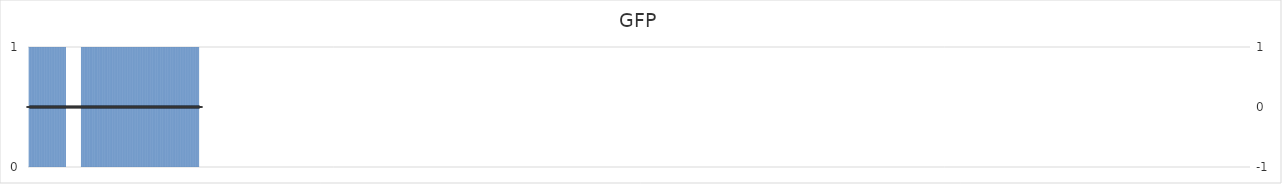
| Category | GFP |
|---|---|
| 1.0 | 0 |
| 2.0 | 1 |
| 3.0 | 1 |
| 4.0 | 1 |
| 5.0 | 1 |
| 6.0 | 1 |
| 7.0 | 1 |
| 8.0 | 1 |
| 9.0 | 1 |
| 10.0 | 1 |
| 11.0 | 1 |
| 12.0 | 1 |
| 13.0 | 1 |
| 14.0 | 1 |
| 15.0 | 1 |
| 16.0 | 1 |
| 17.0 | 1 |
| 18.0 | 1 |
| 19.0 | 1 |
| 20.0 | 1 |
| 21.0 | 1 |
| 22.0 | 1 |
| 23.0 | 1 |
| 24.0 | 1 |
| 25.0 | 1 |
| 26.0 | 1 |
| 27.0 | 1 |
| 28.0 | 1 |
| 29.0 | 1 |
| 30.0 | 1 |
| 31.0 | 1 |
| 32.0 | 1 |
| 33.0 | 1 |
| 34.0 | 1 |
| 35.0 | 1 |
| 36.0 | 1 |
| 37.0 | 1 |
| 38.0 | 1 |
| 39.0 | 1 |
| 40.0 | 1 |
| 41.0 | 1 |
| 42.0 | 1 |
| 43.0 | 1 |
| 44.0 | 1 |
| 45.0 | 1 |
| 46.0 | 1 |
| 47.0 | 1 |
| 48.0 | 1 |
| 49.0 | 1 |
| 50.0 | 1 |
| 51.0 | 1 |
| 52.0 | 1 |
| 53.0 | 1 |
| 54.0 | 0 |
| 55.0 | 0 |
| 56.0 | 0 |
| 57.0 | 0 |
| 58.0 | 0 |
| 59.0 | 0 |
| 60.0 | 0 |
| 61.0 | 0 |
| 62.0 | 0 |
| 63.0 | 0 |
| 64.0 | 0 |
| 65.0 | 0 |
| 66.0 | 0 |
| 67.0 | 0 |
| 68.0 | 0 |
| 69.0 | 0 |
| 70.0 | 0 |
| 71.0 | 0 |
| 72.0 | 0 |
| 73.0 | 0 |
| 74.0 | 0 |
| 75.0 | 1 |
| 76.0 | 1 |
| 77.0 | 1 |
| 78.0 | 1 |
| 79.0 | 1 |
| 80.0 | 1 |
| 81.0 | 1 |
| 82.0 | 1 |
| 83.0 | 1 |
| 84.0 | 1 |
| 85.0 | 1 |
| 86.0 | 1 |
| 87.0 | 1 |
| 88.0 | 1 |
| 89.0 | 1 |
| 90.0 | 1 |
| 91.0 | 1 |
| 92.0 | 1 |
| 93.0 | 1 |
| 94.0 | 1 |
| 95.0 | 1 |
| 96.0 | 1 |
| 97.0 | 1 |
| 98.0 | 1 |
| 99.0 | 1 |
| 100.0 | 1 |
| 101.0 | 1 |
| 102.0 | 1 |
| 103.0 | 1 |
| 104.0 | 1 |
| 105.0 | 1 |
| 106.0 | 1 |
| 107.0 | 1 |
| 108.0 | 1 |
| 109.0 | 1 |
| 110.0 | 1 |
| 111.0 | 1 |
| 112.0 | 1 |
| 113.0 | 1 |
| 114.0 | 1 |
| 115.0 | 1 |
| 116.0 | 1 |
| 117.0 | 1 |
| 118.0 | 1 |
| 119.0 | 1 |
| 120.0 | 1 |
| 121.0 | 1 |
| 122.0 | 1 |
| 123.0 | 1 |
| 124.0 | 1 |
| 125.0 | 1 |
| 126.0 | 1 |
| 127.0 | 1 |
| 128.0 | 1 |
| 129.0 | 1 |
| 130.0 | 1 |
| 131.0 | 1 |
| 132.0 | 1 |
| 133.0 | 1 |
| 134.0 | 1 |
| 135.0 | 1 |
| 136.0 | 1 |
| 137.0 | 1 |
| 138.0 | 1 |
| 139.0 | 1 |
| 140.0 | 1 |
| 141.0 | 1 |
| 142.0 | 1 |
| 143.0 | 1 |
| 144.0 | 1 |
| 145.0 | 1 |
| 146.0 | 1 |
| 147.0 | 1 |
| 148.0 | 1 |
| 149.0 | 1 |
| 150.0 | 1 |
| 151.0 | 1 |
| 152.0 | 1 |
| 153.0 | 1 |
| 154.0 | 1 |
| 155.0 | 1 |
| 156.0 | 1 |
| 157.0 | 1 |
| 158.0 | 1 |
| 159.0 | 1 |
| 160.0 | 1 |
| 161.0 | 1 |
| 162.0 | 1 |
| 163.0 | 1 |
| 164.0 | 1 |
| 165.0 | 1 |
| 166.0 | 1 |
| 167.0 | 1 |
| 168.0 | 1 |
| 169.0 | 1 |
| 170.0 | 1 |
| 171.0 | 1 |
| 172.0 | 1 |
| 173.0 | 1 |
| 174.0 | 1 |
| 175.0 | 1 |
| 176.0 | 1 |
| 177.0 | 1 |
| 178.0 | 1 |
| 179.0 | 1 |
| 180.0 | 1 |
| 181.0 | 1 |
| 182.0 | 1 |
| 183.0 | 1 |
| 184.0 | 1 |
| 185.0 | 1 |
| 186.0 | 1 |
| 187.0 | 1 |
| 188.0 | 1 |
| 189.0 | 1 |
| 190.0 | 1 |
| 191.0 | 1 |
| 192.0 | 1 |
| 193.0 | 1 |
| 194.0 | 1 |
| 195.0 | 1 |
| 196.0 | 1 |
| 197.0 | 1 |
| 198.0 | 1 |
| 199.0 | 1 |
| 200.0 | 1 |
| 201.0 | 1 |
| 202.0 | 1 |
| 203.0 | 1 |
| 204.0 | 1 |
| 205.0 | 1 |
| 206.0 | 1 |
| 207.0 | 1 |
| 208.0 | 1 |
| 209.0 | 1 |
| 210.0 | 1 |
| 211.0 | 1 |
| 212.0 | 1 |
| 213.0 | 1 |
| 214.0 | 1 |
| 215.0 | 1 |
| 216.0 | 1 |
| 217.0 | 1 |
| 218.0 | 1 |
| 219.0 | 1 |
| 220.0 | 1 |
| 221.0 | 1 |
| 222.0 | 1 |
| 223.0 | 1 |
| 224.0 | 1 |
| 225.0 | 1 |
| 226.0 | 1 |
| 227.0 | 1 |
| 228.0 | 1 |
| 229.0 | 1 |
| 230.0 | 1 |
| 231.0 | 1 |
| 232.0 | 1 |
| 233.0 | 1 |
| 234.0 | 1 |
| 235.0 | 1 |
| 236.0 | 1 |
| 237.0 | 1 |
| 238.0 | 1 |
| 239.0 | 1 |
| 240.0 | 0 |
| 241.0 | 0 |
| 242.0 | 0 |
| 243.0 | 0 |
| 244.0 | 0 |
| 245.0 | 0 |
| 246.0 | 0 |
| 247.0 | 0 |
| 248.0 | 0 |
| 249.0 | 0 |
| 250.0 | 0 |
| 251.0 | 0 |
| 252.0 | 0 |
| 253.0 | 0 |
| 254.0 | 0 |
| 255.0 | 0 |
| 256.0 | 0 |
| 257.0 | 0 |
| 258.0 | 0 |
| 259.0 | 0 |
| 260.0 | 0 |
| 261.0 | 0 |
| 262.0 | 0 |
| 263.0 | 0 |
| 264.0 | 0 |
| 265.0 | 0 |
| 266.0 | 0 |
| 267.0 | 0 |
| 268.0 | 0 |
| 269.0 | 0 |
| 270.0 | 0 |
| 271.0 | 0 |
| 272.0 | 0 |
| 273.0 | 0 |
| 274.0 | 0 |
| 275.0 | 0 |
| 276.0 | 0 |
| 277.0 | 0 |
| 278.0 | 0 |
| 279.0 | 0 |
| 280.0 | 0 |
| 281.0 | 0 |
| 282.0 | 0 |
| 283.0 | 0 |
| 284.0 | 0 |
| 285.0 | 0 |
| 286.0 | 0 |
| 287.0 | 0 |
| 288.0 | 0 |
| 289.0 | 0 |
| 290.0 | 0 |
| 291.0 | 0 |
| 292.0 | 0 |
| 293.0 | 0 |
| 294.0 | 0 |
| 295.0 | 0 |
| 296.0 | 0 |
| 297.0 | 0 |
| 298.0 | 0 |
| 299.0 | 0 |
| 300.0 | 0 |
| 301.0 | 0 |
| 302.0 | 0 |
| 303.0 | 0 |
| 304.0 | 0 |
| 305.0 | 0 |
| 306.0 | 0 |
| 307.0 | 0 |
| 308.0 | 0 |
| 309.0 | 0 |
| 310.0 | 0 |
| 311.0 | 0 |
| 312.0 | 0 |
| 313.0 | 0 |
| 314.0 | 0 |
| 315.0 | 0 |
| 316.0 | 0 |
| 317.0 | 0 |
| 318.0 | 0 |
| 319.0 | 0 |
| 320.0 | 0 |
| 321.0 | 0 |
| 322.0 | 0 |
| 323.0 | 0 |
| 324.0 | 0 |
| 325.0 | 0 |
| 326.0 | 0 |
| 327.0 | 0 |
| 328.0 | 0 |
| 329.0 | 0 |
| 330.0 | 0 |
| 331.0 | 0 |
| 332.0 | 0 |
| 333.0 | 0 |
| 334.0 | 0 |
| 335.0 | 0 |
| 336.0 | 0 |
| 337.0 | 0 |
| 338.0 | 0 |
| 339.0 | 0 |
| 340.0 | 0 |
| 341.0 | 0 |
| 342.0 | 0 |
| 343.0 | 0 |
| 344.0 | 0 |
| 345.0 | 0 |
| 346.0 | 0 |
| 347.0 | 0 |
| 348.0 | 0 |
| 349.0 | 0 |
| 350.0 | 0 |
| 351.0 | 0 |
| 352.0 | 0 |
| 353.0 | 0 |
| 354.0 | 0 |
| 355.0 | 0 |
| 356.0 | 0 |
| 357.0 | 0 |
| 358.0 | 0 |
| 359.0 | 0 |
| 360.0 | 0 |
| 361.0 | 0 |
| 362.0 | 0 |
| 363.0 | 0 |
| 364.0 | 0 |
| 365.0 | 0 |
| 366.0 | 0 |
| 367.0 | 0 |
| 368.0 | 0 |
| 369.0 | 0 |
| 370.0 | 0 |
| 371.0 | 0 |
| 372.0 | 0 |
| 373.0 | 0 |
| 374.0 | 0 |
| 375.0 | 0 |
| 376.0 | 0 |
| 377.0 | 0 |
| 378.0 | 0 |
| 379.0 | 0 |
| 380.0 | 0 |
| 381.0 | 0 |
| 382.0 | 0 |
| 383.0 | 0 |
| 384.0 | 0 |
| 385.0 | 0 |
| 386.0 | 0 |
| 387.0 | 0 |
| 388.0 | 0 |
| 389.0 | 0 |
| 390.0 | 0 |
| 391.0 | 0 |
| 392.0 | 0 |
| 393.0 | 0 |
| 394.0 | 0 |
| 395.0 | 0 |
| 396.0 | 0 |
| 397.0 | 0 |
| 398.0 | 0 |
| 399.0 | 0 |
| 400.0 | 0 |
| 401.0 | 0 |
| 402.0 | 0 |
| 403.0 | 0 |
| 404.0 | 0 |
| 405.0 | 0 |
| 406.0 | 0 |
| 407.0 | 0 |
| 408.0 | 0 |
| 409.0 | 0 |
| 410.0 | 0 |
| 411.0 | 0 |
| 412.0 | 0 |
| 413.0 | 0 |
| 414.0 | 0 |
| 415.0 | 0 |
| 416.0 | 0 |
| 417.0 | 0 |
| 418.0 | 0 |
| 419.0 | 0 |
| 420.0 | 0 |
| 421.0 | 0 |
| 422.0 | 0 |
| 423.0 | 0 |
| 424.0 | 0 |
| 425.0 | 0 |
| 426.0 | 0 |
| 427.0 | 0 |
| 428.0 | 0 |
| 429.0 | 0 |
| 430.0 | 0 |
| 431.0 | 0 |
| 432.0 | 0 |
| 433.0 | 0 |
| 434.0 | 0 |
| 435.0 | 0 |
| 436.0 | 0 |
| 437.0 | 0 |
| 438.0 | 0 |
| 439.0 | 0 |
| 440.0 | 0 |
| 441.0 | 0 |
| 442.0 | 0 |
| 443.0 | 0 |
| 444.0 | 0 |
| 445.0 | 0 |
| 446.0 | 0 |
| 447.0 | 0 |
| 448.0 | 0 |
| 449.0 | 0 |
| 450.0 | 0 |
| 451.0 | 0 |
| 452.0 | 0 |
| 453.0 | 0 |
| 454.0 | 0 |
| 455.0 | 0 |
| 456.0 | 0 |
| 457.0 | 0 |
| 458.0 | 0 |
| 459.0 | 0 |
| 460.0 | 0 |
| 461.0 | 0 |
| 462.0 | 0 |
| 463.0 | 0 |
| 464.0 | 0 |
| 465.0 | 0 |
| 466.0 | 0 |
| 467.0 | 0 |
| 468.0 | 0 |
| 469.0 | 0 |
| 470.0 | 0 |
| 471.0 | 0 |
| 472.0 | 0 |
| 473.0 | 0 |
| 474.0 | 0 |
| 475.0 | 0 |
| 476.0 | 0 |
| 477.0 | 0 |
| 478.0 | 0 |
| 479.0 | 0 |
| 480.0 | 0 |
| 481.0 | 0 |
| 482.0 | 0 |
| 483.0 | 0 |
| 484.0 | 0 |
| 485.0 | 0 |
| 486.0 | 0 |
| 487.0 | 0 |
| 488.0 | 0 |
| 489.0 | 0 |
| 490.0 | 0 |
| 491.0 | 0 |
| 492.0 | 0 |
| 493.0 | 0 |
| 494.0 | 0 |
| 495.0 | 0 |
| 496.0 | 0 |
| 497.0 | 0 |
| 498.0 | 0 |
| 499.0 | 0 |
| 500.0 | 0 |
| 501.0 | 0 |
| 502.0 | 0 |
| 503.0 | 0 |
| 504.0 | 0 |
| 505.0 | 0 |
| 506.0 | 0 |
| 507.0 | 0 |
| 508.0 | 0 |
| 509.0 | 0 |
| 510.0 | 0 |
| 511.0 | 0 |
| 512.0 | 0 |
| 513.0 | 0 |
| 514.0 | 0 |
| 515.0 | 0 |
| 516.0 | 0 |
| 517.0 | 0 |
| 518.0 | 0 |
| 519.0 | 0 |
| 520.0 | 0 |
| 521.0 | 0 |
| 522.0 | 0 |
| 523.0 | 0 |
| 524.0 | 0 |
| 525.0 | 0 |
| 526.0 | 0 |
| 527.0 | 0 |
| 528.0 | 0 |
| 529.0 | 0 |
| 530.0 | 0 |
| 531.0 | 0 |
| 532.0 | 0 |
| 533.0 | 0 |
| 534.0 | 0 |
| 535.0 | 0 |
| 536.0 | 0 |
| 537.0 | 0 |
| 538.0 | 0 |
| 539.0 | 0 |
| 540.0 | 0 |
| 541.0 | 0 |
| 542.0 | 0 |
| 543.0 | 0 |
| 544.0 | 0 |
| 545.0 | 0 |
| 546.0 | 0 |
| 547.0 | 0 |
| 548.0 | 0 |
| 549.0 | 0 |
| 550.0 | 0 |
| 551.0 | 0 |
| 552.0 | 0 |
| 553.0 | 0 |
| 554.0 | 0 |
| 555.0 | 0 |
| 556.0 | 0 |
| 557.0 | 0 |
| 558.0 | 0 |
| 559.0 | 0 |
| 560.0 | 0 |
| 561.0 | 0 |
| 562.0 | 0 |
| 563.0 | 0 |
| 564.0 | 0 |
| 565.0 | 0 |
| 566.0 | 0 |
| 567.0 | 0 |
| 568.0 | 0 |
| 569.0 | 0 |
| 570.0 | 0 |
| 571.0 | 0 |
| 572.0 | 0 |
| 573.0 | 0 |
| 574.0 | 0 |
| 575.0 | 0 |
| 576.0 | 0 |
| 577.0 | 0 |
| 578.0 | 0 |
| 579.0 | 0 |
| 580.0 | 0 |
| 581.0 | 0 |
| 582.0 | 0 |
| 583.0 | 0 |
| 584.0 | 0 |
| 585.0 | 0 |
| 586.0 | 0 |
| 587.0 | 0 |
| 588.0 | 0 |
| 589.0 | 0 |
| 590.0 | 0 |
| 591.0 | 0 |
| 592.0 | 0 |
| 593.0 | 0 |
| 594.0 | 0 |
| 595.0 | 0 |
| 596.0 | 0 |
| 597.0 | 0 |
| 598.0 | 0 |
| 599.0 | 0 |
| 600.0 | 0 |
| 601.0 | 0 |
| 602.0 | 0 |
| 603.0 | 0 |
| 604.0 | 0 |
| 605.0 | 0 |
| 606.0 | 0 |
| 607.0 | 0 |
| 608.0 | 0 |
| 609.0 | 0 |
| 610.0 | 0 |
| 611.0 | 0 |
| 612.0 | 0 |
| 613.0 | 0 |
| 614.0 | 0 |
| 615.0 | 0 |
| 616.0 | 0 |
| 617.0 | 0 |
| 618.0 | 0 |
| 619.0 | 0 |
| 620.0 | 0 |
| 621.0 | 0 |
| 622.0 | 0 |
| 623.0 | 0 |
| 624.0 | 0 |
| 625.0 | 0 |
| 626.0 | 0 |
| 627.0 | 0 |
| 628.0 | 0 |
| 629.0 | 0 |
| 630.0 | 0 |
| 631.0 | 0 |
| 632.0 | 0 |
| 633.0 | 0 |
| 634.0 | 0 |
| 635.0 | 0 |
| 636.0 | 0 |
| 637.0 | 0 |
| 638.0 | 0 |
| 639.0 | 0 |
| 640.0 | 0 |
| 641.0 | 0 |
| 642.0 | 0 |
| 643.0 | 0 |
| 644.0 | 0 |
| 645.0 | 0 |
| 646.0 | 0 |
| 647.0 | 0 |
| 648.0 | 0 |
| 649.0 | 0 |
| 650.0 | 0 |
| 651.0 | 0 |
| 652.0 | 0 |
| 653.0 | 0 |
| 654.0 | 0 |
| 655.0 | 0 |
| 656.0 | 0 |
| 657.0 | 0 |
| 658.0 | 0 |
| 659.0 | 0 |
| 660.0 | 0 |
| 661.0 | 0 |
| 662.0 | 0 |
| 663.0 | 0 |
| 664.0 | 0 |
| 665.0 | 0 |
| 666.0 | 0 |
| 667.0 | 0 |
| 668.0 | 0 |
| 669.0 | 0 |
| 670.0 | 0 |
| 671.0 | 0 |
| 672.0 | 0 |
| 673.0 | 0 |
| 674.0 | 0 |
| 675.0 | 0 |
| 676.0 | 0 |
| 677.0 | 0 |
| 678.0 | 0 |
| 679.0 | 0 |
| 680.0 | 0 |
| 681.0 | 0 |
| 682.0 | 0 |
| 683.0 | 0 |
| 684.0 | 0 |
| 685.0 | 0 |
| 686.0 | 0 |
| 687.0 | 0 |
| 688.0 | 0 |
| 689.0 | 0 |
| 690.0 | 0 |
| 691.0 | 0 |
| 692.0 | 0 |
| 693.0 | 0 |
| 694.0 | 0 |
| 695.0 | 0 |
| 696.0 | 0 |
| 697.0 | 0 |
| 698.0 | 0 |
| 699.0 | 0 |
| 700.0 | 0 |
| 701.0 | 0 |
| 702.0 | 0 |
| 703.0 | 0 |
| 704.0 | 0 |
| 705.0 | 0 |
| 706.0 | 0 |
| 707.0 | 0 |
| 708.0 | 0 |
| 709.0 | 0 |
| 710.0 | 0 |
| 711.0 | 0 |
| 712.0 | 0 |
| 713.0 | 0 |
| 714.0 | 0 |
| 715.0 | 0 |
| 716.0 | 0 |
| 717.0 | 0 |
| 718.0 | 0 |
| 719.0 | 0 |
| 720.0 | 0 |
| 721.0 | 0 |
| 722.0 | 0 |
| 723.0 | 0 |
| 724.0 | 0 |
| 725.0 | 0 |
| 726.0 | 0 |
| 727.0 | 0 |
| 728.0 | 0 |
| 729.0 | 0 |
| 730.0 | 0 |
| 731.0 | 0 |
| 732.0 | 0 |
| 733.0 | 0 |
| 734.0 | 0 |
| 735.0 | 0 |
| 736.0 | 0 |
| 737.0 | 0 |
| 738.0 | 0 |
| 739.0 | 0 |
| 740.0 | 0 |
| 741.0 | 0 |
| 742.0 | 0 |
| 743.0 | 0 |
| 744.0 | 0 |
| 745.0 | 0 |
| 746.0 | 0 |
| 747.0 | 0 |
| 748.0 | 0 |
| 749.0 | 0 |
| 750.0 | 0 |
| 751.0 | 0 |
| 752.0 | 0 |
| 753.0 | 0 |
| 754.0 | 0 |
| 755.0 | 0 |
| 756.0 | 0 |
| 757.0 | 0 |
| 758.0 | 0 |
| 759.0 | 0 |
| 760.0 | 0 |
| 761.0 | 0 |
| 762.0 | 0 |
| 763.0 | 0 |
| 764.0 | 0 |
| 765.0 | 0 |
| 766.0 | 0 |
| 767.0 | 0 |
| 768.0 | 0 |
| 769.0 | 0 |
| 770.0 | 0 |
| 771.0 | 0 |
| 772.0 | 0 |
| 773.0 | 0 |
| 774.0 | 0 |
| 775.0 | 0 |
| 776.0 | 0 |
| 777.0 | 0 |
| 778.0 | 0 |
| 779.0 | 0 |
| 780.0 | 0 |
| 781.0 | 0 |
| 782.0 | 0 |
| 783.0 | 0 |
| 784.0 | 0 |
| 785.0 | 0 |
| 786.0 | 0 |
| 787.0 | 0 |
| 788.0 | 0 |
| 789.0 | 0 |
| 790.0 | 0 |
| 791.0 | 0 |
| 792.0 | 0 |
| 793.0 | 0 |
| 794.0 | 0 |
| 795.0 | 0 |
| 796.0 | 0 |
| 797.0 | 0 |
| 798.0 | 0 |
| 799.0 | 0 |
| 800.0 | 0 |
| 801.0 | 0 |
| 802.0 | 0 |
| 803.0 | 0 |
| 804.0 | 0 |
| 805.0 | 0 |
| 806.0 | 0 |
| 807.0 | 0 |
| 808.0 | 0 |
| 809.0 | 0 |
| 810.0 | 0 |
| 811.0 | 0 |
| 812.0 | 0 |
| 813.0 | 0 |
| 814.0 | 0 |
| 815.0 | 0 |
| 816.0 | 0 |
| 817.0 | 0 |
| 818.0 | 0 |
| 819.0 | 0 |
| 820.0 | 0 |
| 821.0 | 0 |
| 822.0 | 0 |
| 823.0 | 0 |
| 824.0 | 0 |
| 825.0 | 0 |
| 826.0 | 0 |
| 827.0 | 0 |
| 828.0 | 0 |
| 829.0 | 0 |
| 830.0 | 0 |
| 831.0 | 0 |
| 832.0 | 0 |
| 833.0 | 0 |
| 834.0 | 0 |
| 835.0 | 0 |
| 836.0 | 0 |
| 837.0 | 0 |
| 838.0 | 0 |
| 839.0 | 0 |
| 840.0 | 0 |
| 841.0 | 0 |
| 842.0 | 0 |
| 843.0 | 0 |
| 844.0 | 0 |
| 845.0 | 0 |
| 846.0 | 0 |
| 847.0 | 0 |
| 848.0 | 0 |
| 849.0 | 0 |
| 850.0 | 0 |
| 851.0 | 0 |
| 852.0 | 0 |
| 853.0 | 0 |
| 854.0 | 0 |
| 855.0 | 0 |
| 856.0 | 0 |
| 857.0 | 0 |
| 858.0 | 0 |
| 859.0 | 0 |
| 860.0 | 0 |
| 861.0 | 0 |
| 862.0 | 0 |
| 863.0 | 0 |
| 864.0 | 0 |
| 865.0 | 0 |
| 866.0 | 0 |
| 867.0 | 0 |
| 868.0 | 0 |
| 869.0 | 0 |
| 870.0 | 0 |
| 871.0 | 0 |
| 872.0 | 0 |
| 873.0 | 0 |
| 874.0 | 0 |
| 875.0 | 0 |
| 876.0 | 0 |
| 877.0 | 0 |
| 878.0 | 0 |
| 879.0 | 0 |
| 880.0 | 0 |
| 881.0 | 0 |
| 882.0 | 0 |
| 883.0 | 0 |
| 884.0 | 0 |
| 885.0 | 0 |
| 886.0 | 0 |
| 887.0 | 0 |
| 888.0 | 0 |
| 889.0 | 0 |
| 890.0 | 0 |
| 891.0 | 0 |
| 892.0 | 0 |
| 893.0 | 0 |
| 894.0 | 0 |
| 895.0 | 0 |
| 896.0 | 0 |
| 897.0 | 0 |
| 898.0 | 0 |
| 899.0 | 0 |
| 900.0 | 0 |
| 901.0 | 0 |
| 902.0 | 0 |
| 903.0 | 0 |
| 904.0 | 0 |
| 905.0 | 0 |
| 906.0 | 0 |
| 907.0 | 0 |
| 908.0 | 0 |
| 909.0 | 0 |
| 910.0 | 0 |
| 911.0 | 0 |
| 912.0 | 0 |
| 913.0 | 0 |
| 914.0 | 0 |
| 915.0 | 0 |
| 916.0 | 0 |
| 917.0 | 0 |
| 918.0 | 0 |
| 919.0 | 0 |
| 920.0 | 0 |
| 921.0 | 0 |
| 922.0 | 0 |
| 923.0 | 0 |
| 924.0 | 0 |
| 925.0 | 0 |
| 926.0 | 0 |
| 927.0 | 0 |
| 928.0 | 0 |
| 929.0 | 0 |
| 930.0 | 0 |
| 931.0 | 0 |
| 932.0 | 0 |
| 933.0 | 0 |
| 934.0 | 0 |
| 935.0 | 0 |
| 936.0 | 0 |
| 937.0 | 0 |
| 938.0 | 0 |
| 939.0 | 0 |
| 940.0 | 0 |
| 941.0 | 0 |
| 942.0 | 0 |
| 943.0 | 0 |
| 944.0 | 0 |
| 945.0 | 0 |
| 946.0 | 0 |
| 947.0 | 0 |
| 948.0 | 0 |
| 949.0 | 0 |
| 950.0 | 0 |
| 951.0 | 0 |
| 952.0 | 0 |
| 953.0 | 0 |
| 954.0 | 0 |
| 955.0 | 0 |
| 956.0 | 0 |
| 957.0 | 0 |
| 958.0 | 0 |
| 959.0 | 0 |
| 960.0 | 0 |
| 961.0 | 0 |
| 962.0 | 0 |
| 963.0 | 0 |
| 964.0 | 0 |
| 965.0 | 0 |
| 966.0 | 0 |
| 967.0 | 0 |
| 968.0 | 0 |
| 969.0 | 0 |
| 970.0 | 0 |
| 971.0 | 0 |
| 972.0 | 0 |
| 973.0 | 0 |
| 974.0 | 0 |
| 975.0 | 0 |
| 976.0 | 0 |
| 977.0 | 0 |
| 978.0 | 0 |
| 979.0 | 0 |
| 980.0 | 0 |
| 981.0 | 0 |
| 982.0 | 0 |
| 983.0 | 0 |
| 984.0 | 0 |
| 985.0 | 0 |
| 986.0 | 0 |
| 987.0 | 0 |
| 988.0 | 0 |
| 989.0 | 0 |
| 990.0 | 0 |
| 991.0 | 0 |
| 992.0 | 0 |
| 993.0 | 0 |
| 994.0 | 0 |
| 995.0 | 0 |
| 996.0 | 0 |
| 997.0 | 0 |
| 998.0 | 0 |
| 999.0 | 0 |
| 1000.0 | 0 |
| 1001.0 | 0 |
| 1002.0 | 0 |
| 1003.0 | 0 |
| 1004.0 | 0 |
| 1005.0 | 0 |
| 1006.0 | 0 |
| 1007.0 | 0 |
| 1008.0 | 0 |
| 1009.0 | 0 |
| 1010.0 | 0 |
| 1011.0 | 0 |
| 1012.0 | 0 |
| 1013.0 | 0 |
| 1014.0 | 0 |
| 1015.0 | 0 |
| 1016.0 | 0 |
| 1017.0 | 0 |
| 1018.0 | 0 |
| 1019.0 | 0 |
| 1020.0 | 0 |
| 1021.0 | 0 |
| 1022.0 | 0 |
| 1023.0 | 0 |
| 1024.0 | 0 |
| 1025.0 | 0 |
| 1026.0 | 0 |
| 1027.0 | 0 |
| 1028.0 | 0 |
| 1029.0 | 0 |
| 1030.0 | 0 |
| 1031.0 | 0 |
| 1032.0 | 0 |
| 1033.0 | 0 |
| 1034.0 | 0 |
| 1035.0 | 0 |
| 1036.0 | 0 |
| 1037.0 | 0 |
| 1038.0 | 0 |
| 1039.0 | 0 |
| 1040.0 | 0 |
| 1041.0 | 0 |
| 1042.0 | 0 |
| 1043.0 | 0 |
| 1044.0 | 0 |
| 1045.0 | 0 |
| 1046.0 | 0 |
| 1047.0 | 0 |
| 1048.0 | 0 |
| 1049.0 | 0 |
| 1050.0 | 0 |
| 1051.0 | 0 |
| 1052.0 | 0 |
| 1053.0 | 0 |
| 1054.0 | 0 |
| 1055.0 | 0 |
| 1056.0 | 0 |
| 1057.0 | 0 |
| 1058.0 | 0 |
| 1059.0 | 0 |
| 1060.0 | 0 |
| 1061.0 | 0 |
| 1062.0 | 0 |
| 1063.0 | 0 |
| 1064.0 | 0 |
| 1065.0 | 0 |
| 1066.0 | 0 |
| 1067.0 | 0 |
| 1068.0 | 0 |
| 1069.0 | 0 |
| 1070.0 | 0 |
| 1071.0 | 0 |
| 1072.0 | 0 |
| 1073.0 | 0 |
| 1074.0 | 0 |
| 1075.0 | 0 |
| 1076.0 | 0 |
| 1077.0 | 0 |
| 1078.0 | 0 |
| 1079.0 | 0 |
| 1080.0 | 0 |
| 1081.0 | 0 |
| 1082.0 | 0 |
| 1083.0 | 0 |
| 1084.0 | 0 |
| 1085.0 | 0 |
| 1086.0 | 0 |
| 1087.0 | 0 |
| 1088.0 | 0 |
| 1089.0 | 0 |
| 1090.0 | 0 |
| 1091.0 | 0 |
| 1092.0 | 0 |
| 1093.0 | 0 |
| 1094.0 | 0 |
| 1095.0 | 0 |
| 1096.0 | 0 |
| 1097.0 | 0 |
| 1098.0 | 0 |
| 1099.0 | 0 |
| 1100.0 | 0 |
| 1101.0 | 0 |
| 1102.0 | 0 |
| 1103.0 | 0 |
| 1104.0 | 0 |
| 1105.0 | 0 |
| 1106.0 | 0 |
| 1107.0 | 0 |
| 1108.0 | 0 |
| 1109.0 | 0 |
| 1110.0 | 0 |
| 1111.0 | 0 |
| 1112.0 | 0 |
| 1113.0 | 0 |
| 1114.0 | 0 |
| 1115.0 | 0 |
| 1116.0 | 0 |
| 1117.0 | 0 |
| 1118.0 | 0 |
| 1119.0 | 0 |
| 1120.0 | 0 |
| 1121.0 | 0 |
| 1122.0 | 0 |
| 1123.0 | 0 |
| 1124.0 | 0 |
| 1125.0 | 0 |
| 1126.0 | 0 |
| 1127.0 | 0 |
| 1128.0 | 0 |
| 1129.0 | 0 |
| 1130.0 | 0 |
| 1131.0 | 0 |
| 1132.0 | 0 |
| 1133.0 | 0 |
| 1134.0 | 0 |
| 1135.0 | 0 |
| 1136.0 | 0 |
| 1137.0 | 0 |
| 1138.0 | 0 |
| 1139.0 | 0 |
| 1140.0 | 0 |
| 1141.0 | 0 |
| 1142.0 | 0 |
| 1143.0 | 0 |
| 1144.0 | 0 |
| 1145.0 | 0 |
| 1146.0 | 0 |
| 1147.0 | 0 |
| 1148.0 | 0 |
| 1149.0 | 0 |
| 1150.0 | 0 |
| 1151.0 | 0 |
| 1152.0 | 0 |
| 1153.0 | 0 |
| 1154.0 | 0 |
| 1155.0 | 0 |
| 1156.0 | 0 |
| 1157.0 | 0 |
| 1158.0 | 0 |
| 1159.0 | 0 |
| 1160.0 | 0 |
| 1161.0 | 0 |
| 1162.0 | 0 |
| 1163.0 | 0 |
| 1164.0 | 0 |
| 1165.0 | 0 |
| 1166.0 | 0 |
| 1167.0 | 0 |
| 1168.0 | 0 |
| 1169.0 | 0 |
| 1170.0 | 0 |
| 1171.0 | 0 |
| 1172.0 | 0 |
| 1173.0 | 0 |
| 1174.0 | 0 |
| 1175.0 | 0 |
| 1176.0 | 0 |
| 1177.0 | 0 |
| 1178.0 | 0 |
| 1179.0 | 0 |
| 1180.0 | 0 |
| 1181.0 | 0 |
| 1182.0 | 0 |
| 1183.0 | 0 |
| 1184.0 | 0 |
| 1185.0 | 0 |
| 1186.0 | 0 |
| 1187.0 | 0 |
| 1188.0 | 0 |
| 1189.0 | 0 |
| 1190.0 | 0 |
| 1191.0 | 0 |
| 1192.0 | 0 |
| 1193.0 | 0 |
| 1194.0 | 0 |
| 1195.0 | 0 |
| 1196.0 | 0 |
| 1197.0 | 0 |
| 1198.0 | 0 |
| 1199.0 | 0 |
| 1200.0 | 0 |
| 1201.0 | 0 |
| 1202.0 | 0 |
| 1203.0 | 0 |
| 1204.0 | 0 |
| 1205.0 | 0 |
| 1206.0 | 0 |
| 1207.0 | 0 |
| 1208.0 | 0 |
| 1209.0 | 0 |
| 1210.0 | 0 |
| 1211.0 | 0 |
| 1212.0 | 0 |
| 1213.0 | 0 |
| 1214.0 | 0 |
| 1215.0 | 0 |
| 1216.0 | 0 |
| 1217.0 | 0 |
| 1218.0 | 0 |
| 1219.0 | 0 |
| 1220.0 | 0 |
| 1221.0 | 0 |
| 1222.0 | 0 |
| 1223.0 | 0 |
| 1224.0 | 0 |
| 1225.0 | 0 |
| 1226.0 | 0 |
| 1227.0 | 0 |
| 1228.0 | 0 |
| 1229.0 | 0 |
| 1230.0 | 0 |
| 1231.0 | 0 |
| 1232.0 | 0 |
| 1233.0 | 0 |
| 1234.0 | 0 |
| 1235.0 | 0 |
| 1236.0 | 0 |
| 1237.0 | 0 |
| 1238.0 | 0 |
| 1239.0 | 0 |
| 1240.0 | 0 |
| 1241.0 | 0 |
| 1242.0 | 0 |
| 1243.0 | 0 |
| 1244.0 | 0 |
| 1245.0 | 0 |
| 1246.0 | 0 |
| 1247.0 | 0 |
| 1248.0 | 0 |
| 1249.0 | 0 |
| 1250.0 | 0 |
| 1251.0 | 0 |
| 1252.0 | 0 |
| 1253.0 | 0 |
| 1254.0 | 0 |
| 1255.0 | 0 |
| 1256.0 | 0 |
| 1257.0 | 0 |
| 1258.0 | 0 |
| 1259.0 | 0 |
| 1260.0 | 0 |
| 1261.0 | 0 |
| 1262.0 | 0 |
| 1263.0 | 0 |
| 1264.0 | 0 |
| 1265.0 | 0 |
| 1266.0 | 0 |
| 1267.0 | 0 |
| 1268.0 | 0 |
| 1269.0 | 0 |
| 1270.0 | 0 |
| 1271.0 | 0 |
| 1272.0 | 0 |
| 1273.0 | 0 |
| 1274.0 | 0 |
| 1275.0 | 0 |
| 1276.0 | 0 |
| 1277.0 | 0 |
| 1278.0 | 0 |
| 1279.0 | 0 |
| 1280.0 | 0 |
| 1281.0 | 0 |
| 1282.0 | 0 |
| 1283.0 | 0 |
| 1284.0 | 0 |
| 1285.0 | 0 |
| 1286.0 | 0 |
| 1287.0 | 0 |
| 1288.0 | 0 |
| 1289.0 | 0 |
| 1290.0 | 0 |
| 1291.0 | 0 |
| 1292.0 | 0 |
| 1293.0 | 0 |
| 1294.0 | 0 |
| 1295.0 | 0 |
| 1296.0 | 0 |
| 1297.0 | 0 |
| 1298.0 | 0 |
| 1299.0 | 0 |
| 1300.0 | 0 |
| 1301.0 | 0 |
| 1302.0 | 0 |
| 1303.0 | 0 |
| 1304.0 | 0 |
| 1305.0 | 0 |
| 1306.0 | 0 |
| 1307.0 | 0 |
| 1308.0 | 0 |
| 1309.0 | 0 |
| 1310.0 | 0 |
| 1311.0 | 0 |
| 1312.0 | 0 |
| 1313.0 | 0 |
| 1314.0 | 0 |
| 1315.0 | 0 |
| 1316.0 | 0 |
| 1317.0 | 0 |
| 1318.0 | 0 |
| 1319.0 | 0 |
| 1320.0 | 0 |
| 1321.0 | 0 |
| 1322.0 | 0 |
| 1323.0 | 0 |
| 1324.0 | 0 |
| 1325.0 | 0 |
| 1326.0 | 0 |
| 1327.0 | 0 |
| 1328.0 | 0 |
| 1329.0 | 0 |
| 1330.0 | 0 |
| 1331.0 | 0 |
| 1332.0 | 0 |
| 1333.0 | 0 |
| 1334.0 | 0 |
| 1335.0 | 0 |
| 1336.0 | 0 |
| 1337.0 | 0 |
| 1338.0 | 0 |
| 1339.0 | 0 |
| 1340.0 | 0 |
| 1341.0 | 0 |
| 1342.0 | 0 |
| 1343.0 | 0 |
| 1344.0 | 0 |
| 1345.0 | 0 |
| 1346.0 | 0 |
| 1347.0 | 0 |
| 1348.0 | 0 |
| 1349.0 | 0 |
| 1350.0 | 0 |
| 1351.0 | 0 |
| 1352.0 | 0 |
| 1353.0 | 0 |
| 1354.0 | 0 |
| 1355.0 | 0 |
| 1356.0 | 0 |
| 1357.0 | 0 |
| 1358.0 | 0 |
| 1359.0 | 0 |
| 1360.0 | 0 |
| 1361.0 | 0 |
| 1362.0 | 0 |
| 1363.0 | 0 |
| 1364.0 | 0 |
| 1365.0 | 0 |
| 1366.0 | 0 |
| 1367.0 | 0 |
| 1368.0 | 0 |
| 1369.0 | 0 |
| 1370.0 | 0 |
| 1371.0 | 0 |
| 1372.0 | 0 |
| 1373.0 | 0 |
| 1374.0 | 0 |
| 1375.0 | 0 |
| 1376.0 | 0 |
| 1377.0 | 0 |
| 1378.0 | 0 |
| 1379.0 | 0 |
| 1380.0 | 0 |
| 1381.0 | 0 |
| 1382.0 | 0 |
| 1383.0 | 0 |
| 1384.0 | 0 |
| 1385.0 | 0 |
| 1386.0 | 0 |
| 1387.0 | 0 |
| 1388.0 | 0 |
| 1389.0 | 0 |
| 1390.0 | 0 |
| 1391.0 | 0 |
| 1392.0 | 0 |
| 1393.0 | 0 |
| 1394.0 | 0 |
| 1395.0 | 0 |
| 1396.0 | 0 |
| 1397.0 | 0 |
| 1398.0 | 0 |
| 1399.0 | 0 |
| 1400.0 | 0 |
| 1401.0 | 0 |
| 1402.0 | 0 |
| 1403.0 | 0 |
| 1404.0 | 0 |
| 1405.0 | 0 |
| 1406.0 | 0 |
| 1407.0 | 0 |
| 1408.0 | 0 |
| 1409.0 | 0 |
| 1410.0 | 0 |
| 1411.0 | 0 |
| 1412.0 | 0 |
| 1413.0 | 0 |
| 1414.0 | 0 |
| 1415.0 | 0 |
| 1416.0 | 0 |
| 1417.0 | 0 |
| 1418.0 | 0 |
| 1419.0 | 0 |
| 1420.0 | 0 |
| 1421.0 | 0 |
| 1422.0 | 0 |
| 1423.0 | 0 |
| 1424.0 | 0 |
| 1425.0 | 0 |
| 1426.0 | 0 |
| 1427.0 | 0 |
| 1428.0 | 0 |
| 1429.0 | 0 |
| 1430.0 | 0 |
| 1431.0 | 0 |
| 1432.0 | 0 |
| 1433.0 | 0 |
| 1434.0 | 0 |
| 1435.0 | 0 |
| 1436.0 | 0 |
| 1437.0 | 0 |
| 1438.0 | 0 |
| 1439.0 | 0 |
| 1440.0 | 0 |
| 1441.0 | 0 |
| 1442.0 | 0 |
| 1443.0 | 0 |
| 1444.0 | 0 |
| 1445.0 | 0 |
| 1446.0 | 0 |
| 1447.0 | 0 |
| 1448.0 | 0 |
| 1449.0 | 0 |
| 1450.0 | 0 |
| 1451.0 | 0 |
| 1452.0 | 0 |
| 1453.0 | 0 |
| 1454.0 | 0 |
| 1455.0 | 0 |
| 1456.0 | 0 |
| 1457.0 | 0 |
| 1458.0 | 0 |
| 1459.0 | 0 |
| 1460.0 | 0 |
| 1461.0 | 0 |
| 1462.0 | 0 |
| 1463.0 | 0 |
| 1464.0 | 0 |
| 1465.0 | 0 |
| 1466.0 | 0 |
| 1467.0 | 0 |
| 1468.0 | 0 |
| 1469.0 | 0 |
| 1470.0 | 0 |
| 1471.0 | 0 |
| 1472.0 | 0 |
| 1473.0 | 0 |
| 1474.0 | 0 |
| 1475.0 | 0 |
| 1476.0 | 0 |
| 1477.0 | 0 |
| 1478.0 | 0 |
| 1479.0 | 0 |
| 1480.0 | 0 |
| 1481.0 | 0 |
| 1482.0 | 0 |
| 1483.0 | 0 |
| 1484.0 | 0 |
| 1485.0 | 0 |
| 1486.0 | 0 |
| 1487.0 | 0 |
| 1488.0 | 0 |
| 1489.0 | 0 |
| 1490.0 | 0 |
| 1491.0 | 0 |
| 1492.0 | 0 |
| 1493.0 | 0 |
| 1494.0 | 0 |
| 1495.0 | 0 |
| 1496.0 | 0 |
| 1497.0 | 0 |
| 1498.0 | 0 |
| 1499.0 | 0 |
| 1500.0 | 0 |
| 1501.0 | 0 |
| 1502.0 | 0 |
| 1503.0 | 0 |
| 1504.0 | 0 |
| 1505.0 | 0 |
| 1506.0 | 0 |
| 1507.0 | 0 |
| 1508.0 | 0 |
| 1509.0 | 0 |
| 1510.0 | 0 |
| 1511.0 | 0 |
| 1512.0 | 0 |
| 1513.0 | 0 |
| 1514.0 | 0 |
| 1515.0 | 0 |
| 1516.0 | 0 |
| 1517.0 | 0 |
| 1518.0 | 0 |
| 1519.0 | 0 |
| 1520.0 | 0 |
| 1521.0 | 0 |
| 1522.0 | 0 |
| 1523.0 | 0 |
| 1524.0 | 0 |
| 1525.0 | 0 |
| 1526.0 | 0 |
| 1527.0 | 0 |
| 1528.0 | 0 |
| 1529.0 | 0 |
| 1530.0 | 0 |
| 1531.0 | 0 |
| 1532.0 | 0 |
| 1533.0 | 0 |
| 1534.0 | 0 |
| 1535.0 | 0 |
| 1536.0 | 0 |
| 1537.0 | 0 |
| 1538.0 | 0 |
| 1539.0 | 0 |
| 1540.0 | 0 |
| 1541.0 | 0 |
| 1542.0 | 0 |
| 1543.0 | 0 |
| 1544.0 | 0 |
| 1545.0 | 0 |
| 1546.0 | 0 |
| 1547.0 | 0 |
| 1548.0 | 0 |
| 1549.0 | 0 |
| 1550.0 | 0 |
| 1551.0 | 0 |
| 1552.0 | 0 |
| 1553.0 | 0 |
| 1554.0 | 0 |
| 1555.0 | 0 |
| 1556.0 | 0 |
| 1557.0 | 0 |
| 1558.0 | 0 |
| 1559.0 | 0 |
| 1560.0 | 0 |
| 1561.0 | 0 |
| 1562.0 | 0 |
| 1563.0 | 0 |
| 1564.0 | 0 |
| 1565.0 | 0 |
| 1566.0 | 0 |
| 1567.0 | 0 |
| 1568.0 | 0 |
| 1569.0 | 0 |
| 1570.0 | 0 |
| 1571.0 | 0 |
| 1572.0 | 0 |
| 1573.0 | 0 |
| 1574.0 | 0 |
| 1575.0 | 0 |
| 1576.0 | 0 |
| 1577.0 | 0 |
| 1578.0 | 0 |
| 1579.0 | 0 |
| 1580.0 | 0 |
| 1581.0 | 0 |
| 1582.0 | 0 |
| 1583.0 | 0 |
| 1584.0 | 0 |
| 1585.0 | 0 |
| 1586.0 | 0 |
| 1587.0 | 0 |
| 1588.0 | 0 |
| 1589.0 | 0 |
| 1590.0 | 0 |
| 1591.0 | 0 |
| 1592.0 | 0 |
| 1593.0 | 0 |
| 1594.0 | 0 |
| 1595.0 | 0 |
| 1596.0 | 0 |
| 1597.0 | 0 |
| 1598.0 | 0 |
| 1599.0 | 0 |
| 1600.0 | 0 |
| 1601.0 | 0 |
| 1602.0 | 0 |
| 1603.0 | 0 |
| 1604.0 | 0 |
| 1605.0 | 0 |
| 1606.0 | 0 |
| 1607.0 | 0 |
| 1608.0 | 0 |
| 1609.0 | 0 |
| 1610.0 | 0 |
| 1611.0 | 0 |
| 1612.0 | 0 |
| 1613.0 | 0 |
| 1614.0 | 0 |
| 1615.0 | 0 |
| 1616.0 | 0 |
| 1617.0 | 0 |
| 1618.0 | 0 |
| 1619.0 | 0 |
| 1620.0 | 0 |
| 1621.0 | 0 |
| 1622.0 | 0 |
| 1623.0 | 0 |
| 1624.0 | 0 |
| 1625.0 | 0 |
| 1626.0 | 0 |
| 1627.0 | 0 |
| 1628.0 | 0 |
| 1629.0 | 0 |
| 1630.0 | 0 |
| 1631.0 | 0 |
| 1632.0 | 0 |
| 1633.0 | 0 |
| 1634.0 | 0 |
| 1635.0 | 0 |
| 1636.0 | 0 |
| 1637.0 | 0 |
| 1638.0 | 0 |
| 1639.0 | 0 |
| 1640.0 | 0 |
| 1641.0 | 0 |
| 1642.0 | 0 |
| 1643.0 | 0 |
| 1644.0 | 0 |
| 1645.0 | 0 |
| 1646.0 | 0 |
| 1647.0 | 0 |
| 1648.0 | 0 |
| 1649.0 | 0 |
| 1650.0 | 0 |
| 1651.0 | 0 |
| 1652.0 | 0 |
| 1653.0 | 0 |
| 1654.0 | 0 |
| 1655.0 | 0 |
| 1656.0 | 0 |
| 1657.0 | 0 |
| 1658.0 | 0 |
| 1659.0 | 0 |
| 1660.0 | 0 |
| 1661.0 | 0 |
| 1662.0 | 0 |
| 1663.0 | 0 |
| 1664.0 | 0 |
| 1665.0 | 0 |
| 1666.0 | 0 |
| 1667.0 | 0 |
| 1668.0 | 0 |
| 1669.0 | 0 |
| 1670.0 | 0 |
| 1671.0 | 0 |
| 1672.0 | 0 |
| 1673.0 | 0 |
| 1674.0 | 0 |
| 1675.0 | 0 |
| 1676.0 | 0 |
| 1677.0 | 0 |
| 1678.0 | 0 |
| 1679.0 | 0 |
| 1680.0 | 0 |
| 1681.0 | 0 |
| 1682.0 | 0 |
| 1683.0 | 0 |
| 1684.0 | 0 |
| 1685.0 | 0 |
| 1686.0 | 0 |
| 1687.0 | 0 |
| 1688.0 | 0 |
| 1689.0 | 0 |
| 1690.0 | 0 |
| 1691.0 | 0 |
| 1692.0 | 0 |
| 1693.0 | 0 |
| 1694.0 | 0 |
| 1695.0 | 0 |
| 1696.0 | 0 |
| 1697.0 | 0 |
| 1698.0 | 0 |
| 1699.0 | 0 |
| 1700.0 | 0 |
| 1701.0 | 0 |
| 1702.0 | 0 |
| 1703.0 | 0 |
| 1704.0 | 0 |
| 1705.0 | 0 |
| 1706.0 | 0 |
| 1707.0 | 0 |